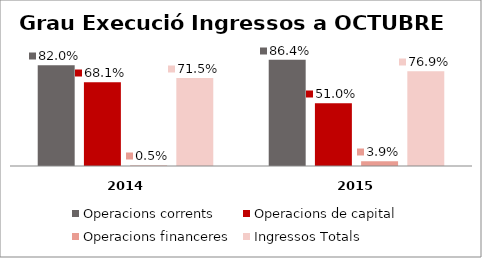
| Category | Operacions corrents | Operacions de capital | Operacions financeres | Ingressos Totals |
|---|---|---|---|---|
| 0 | 0.82 | 0.681 | 0.005 | 0.715 |
| 1 | 0.864 | 0.51 | 0.039 | 0.769 |